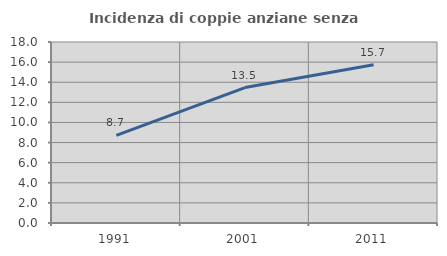
| Category | Incidenza di coppie anziane senza figli  |
|---|---|
| 1991.0 | 8.711 |
| 2001.0 | 13.467 |
| 2011.0 | 15.733 |